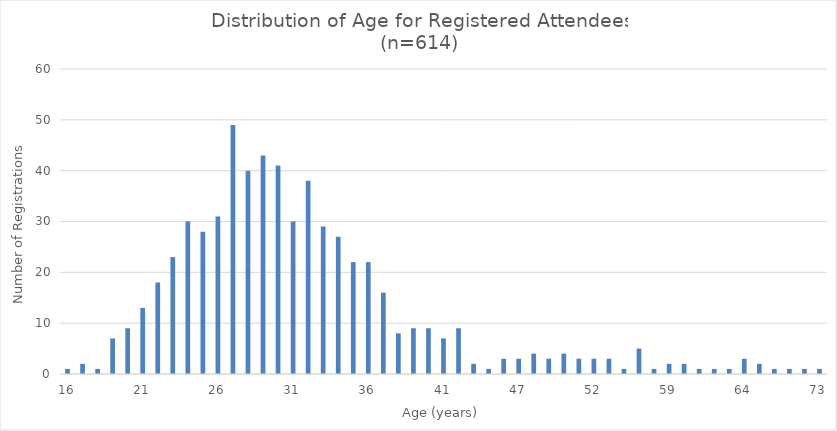
| Category | Frequency |
|---|---|
| 16.0 | 1 |
| 17.0 | 2 |
| 18.0 | 1 |
| 19.0 | 7 |
| 20.0 | 9 |
| 21.0 | 13 |
| 22.0 | 18 |
| 23.0 | 23 |
| 24.0 | 30 |
| 25.0 | 28 |
| 26.0 | 31 |
| 27.0 | 49 |
| 28.0 | 40 |
| 29.0 | 43 |
| 30.0 | 41 |
| 31.0 | 30 |
| 32.0 | 38 |
| 33.0 | 29 |
| 34.0 | 27 |
| 35.0 | 22 |
| 36.0 | 22 |
| 37.0 | 16 |
| 38.0 | 8 |
| 39.0 | 9 |
| 40.0 | 9 |
| 41.0 | 7 |
| 42.0 | 9 |
| 43.0 | 2 |
| 45.0 | 1 |
| 46.0 | 3 |
| 47.0 | 3 |
| 48.0 | 4 |
| 49.0 | 3 |
| 50.0 | 4 |
| 51.0 | 3 |
| 52.0 | 3 |
| 53.0 | 3 |
| 56.0 | 1 |
| 57.0 | 5 |
| 58.0 | 1 |
| 59.0 | 2 |
| 60.0 | 2 |
| 61.0 | 1 |
| 62.0 | 1 |
| 63.0 | 1 |
| 64.0 | 3 |
| 66.0 | 2 |
| 67.0 | 1 |
| 70.0 | 1 |
| 71.0 | 1 |
| 73.0 | 1 |